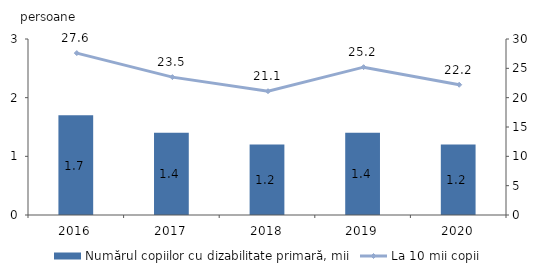
| Category | Numărul copiilor cu dizabilitate primară, mii |
|---|---|
| 2016.0 | 1.7 |
| 2017.0 | 1.4 |
| 2018.0 | 1.2 |
| 2019.0 | 1.4 |
| 2020.0 | 1.2 |